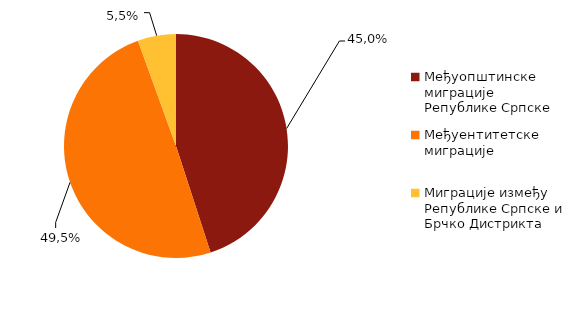
| Category | Series 0 |
|---|---|
| Међуопштинске миграције Републике Српске | 45.003 |
| Међуентитетске миграције | 49.478 |
| Миграције између Републике Српске и Брчко Дистрикта  | 5.519 |